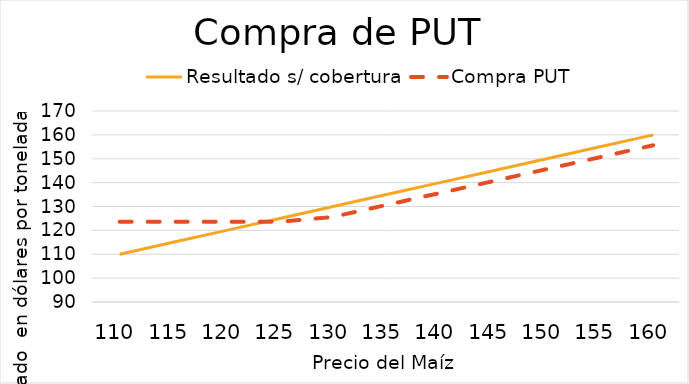
| Category | Resultado s/ cobertura | Compra PUT |
|---|---|---|
| 110.0 | 110 | 123.64 |
| 115.0 | 115 | 123.64 |
| 120.0 | 120 | 123.64 |
| 125.0 | 125 | 123.64 |
| 130.0 | 130 | 125.64 |
| 135.0 | 135 | 130.64 |
| 140.0 | 140 | 135.64 |
| 145.0 | 145 | 140.64 |
| 150.0 | 150 | 145.64 |
| 155.0 | 155 | 150.64 |
| 160.0 | 160 | 155.64 |